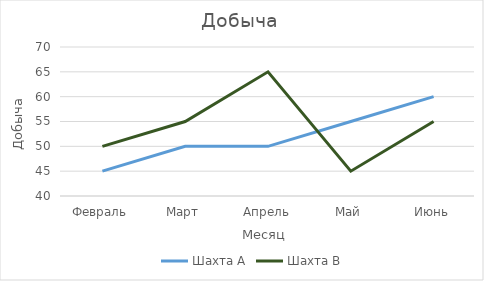
| Category | Шахта А | Шахта B |
|---|---|---|
| Февраль | 45 | 50 |
| Март | 50 | 55 |
| Апрель | 50 | 65 |
| Май | 55 | 45 |
| Июнь | 60 | 55 |